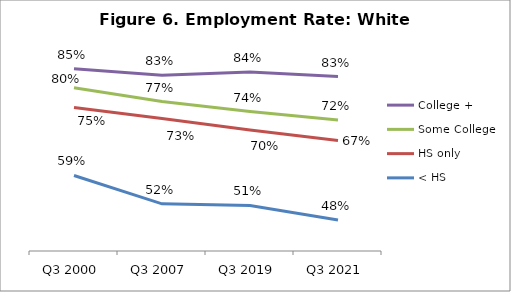
| Category | College + | Some College | HS only | < HS |
|---|---|---|---|---|
| Q3 2000 | 0.85 | 0.803 | 0.754 | 0.586 |
| Q3 2007 | 0.834 | 0.769 | 0.727 | 0.516 |
| Q3 2019 | 0.842 | 0.744 | 0.699 | 0.512 |
| Q3 2021 | 0.831 | 0.724 | 0.673 | 0.476 |